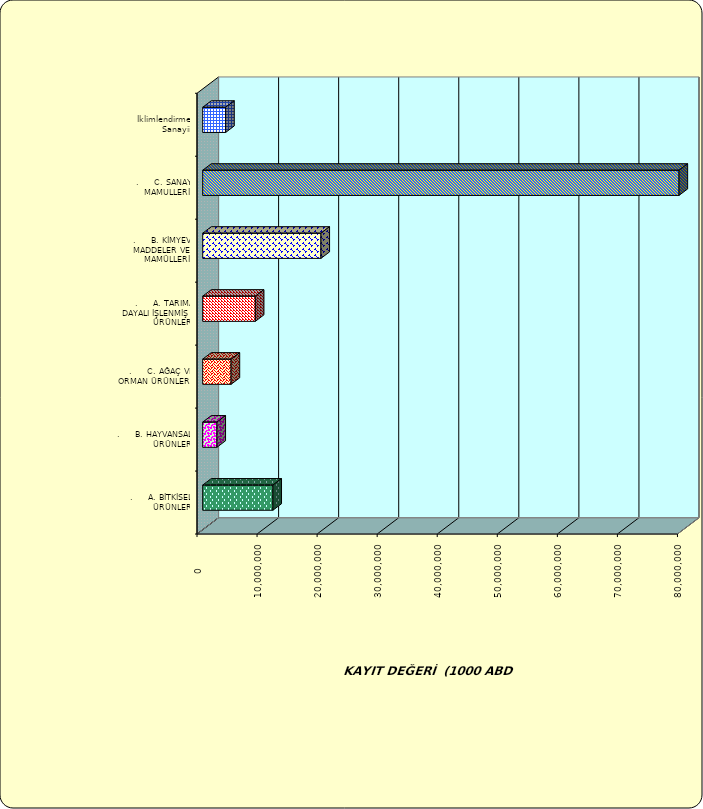
| Category | Series 0 |
|---|---|
| .     A. BİTKİSEL ÜRÜNLER | 11690330.277 |
| .     B. HAYVANSAL ÜRÜNLER | 2371984.966 |
| .     C. AĞAÇ VE ORMAN ÜRÜNLERİ | 4728597.703 |
| .     A. TARIMA DAYALI İŞLENMİŞ ÜRÜNLER | 8764964.974 |
| .     B. KİMYEVİ MADDELER VE MAMÜLLERİ | 19690259.674 |
| .     C. SANAYİ MAMULLERİ | 79313645.6 |
|  İklimlendirme Sanayii | 3822816.282 |